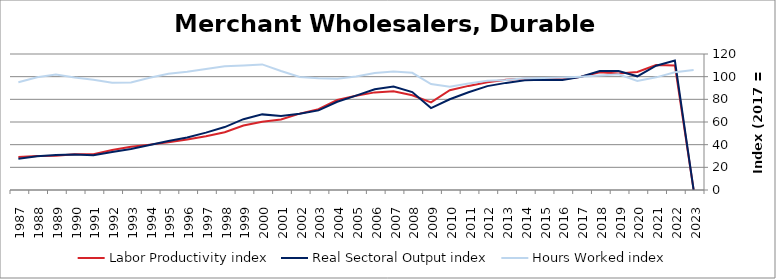
| Category | Labor Productivity index | Real Sectoral Output index | Hours Worked index |
|---|---|---|---|
| 2023.0 | 0 | 0 | 105.902 |
| 2022.0 | 109.943 | 114.178 | 103.851 |
| 2021.0 | 110.31 | 109.65 | 99.402 |
| 2020.0 | 104.214 | 100.315 | 96.259 |
| 2019.0 | 102.897 | 105.045 | 102.088 |
| 2018.0 | 103.875 | 104.915 | 101.001 |
| 2017.0 | 100 | 100 | 100 |
| 2016.0 | 97.817 | 97.087 | 99.254 |
| 2015.0 | 98.444 | 97.333 | 98.872 |
| 2014.0 | 98.167 | 96.811 | 98.618 |
| 2013.0 | 97.332 | 94.512 | 97.103 |
| 2012.0 | 95.09 | 91.669 | 96.403 |
| 2011.0 | 91.853 | 86.247 | 93.897 |
| 2010.0 | 87.996 | 80.082 | 91.006 |
| 2009.0 | 77.309 | 72.308 | 93.53 |
| 2008.0 | 83.539 | 86.398 | 103.421 |
| 2007.0 | 87.193 | 91.249 | 104.652 |
| 2006.0 | 86.131 | 88.849 | 103.155 |
| 2005.0 | 83.108 | 83.308 | 100.241 |
| 2004.0 | 79.381 | 77.873 | 98.101 |
| 2003.0 | 71.239 | 70.253 | 98.617 |
| 2002.0 | 67.405 | 67.223 | 99.73 |
| 2001.0 | 62.257 | 65.363 | 104.99 |
| 2000.0 | 60.2 | 66.724 | 110.836 |
| 1999.0 | 56.85 | 62.503 | 109.944 |
| 1998.0 | 50.903 | 55.528 | 109.086 |
| 1997.0 | 47.357 | 50.607 | 106.864 |
| 1996.0 | 44.49 | 46.39 | 104.272 |
| 1995.0 | 42.194 | 43.274 | 102.559 |
| 1994.0 | 40.036 | 39.639 | 99.008 |
| 1993.0 | 38.174 | 36.221 | 94.883 |
| 1992.0 | 35.345 | 33.473 | 94.705 |
| 1991.0 | 31.607 | 30.74 | 97.258 |
| 1990.0 | 31.521 | 31.32 | 99.36 |
| 1989.0 | 30.321 | 30.907 | 101.931 |
| 1988.0 | 29.954 | 29.776 | 99.404 |
| 1987.0 | 29.057 | 27.628 | 95.082 |